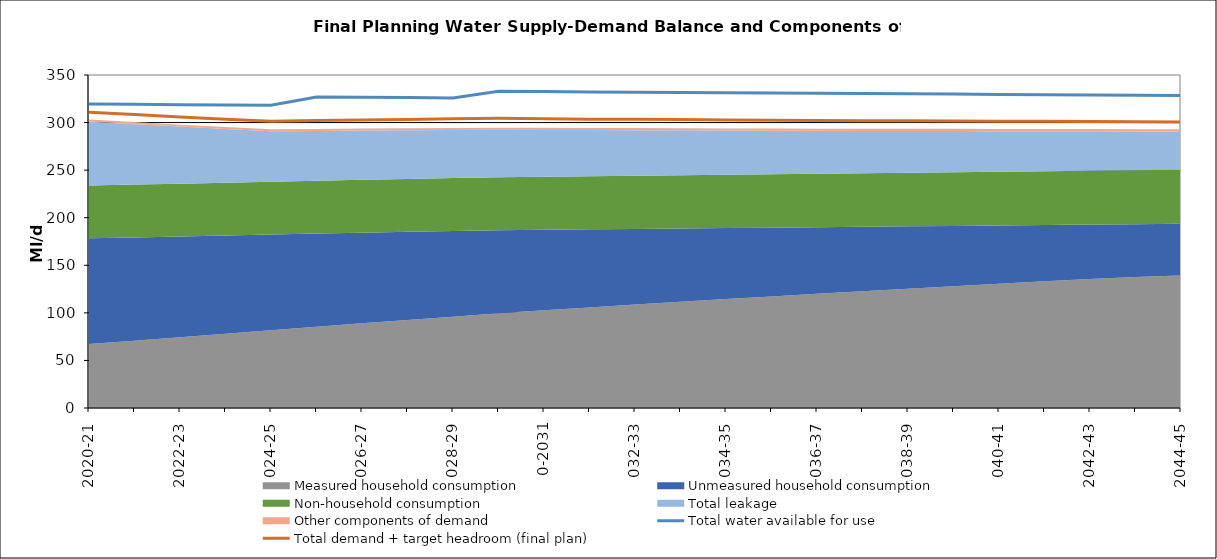
| Category | Total water available for use | Total demand + target headroom (final plan) |
|---|---|---|
| 0 | 319.431 | 310.906 |
| 1 | 319.143 | 308.387 |
| 2 | 318.856 | 305.78 |
| 3 | 318.568 | 303.611 |
| 4 | 318.28 | 301.501 |
| 5 | 326.978 | 302.082 |
| 6 | 326.525 | 302.746 |
| 7 | 326.233 | 303.201 |
| 8 | 325.941 | 303.897 |
| 9 | 332.822 | 304.485 |
| 10 | 332.53 | 304.037 |
| 11 | 332.238 | 303.62 |
| 12 | 331.946 | 303.392 |
| 13 | 331.653 | 303.107 |
| 14 | 331.361 | 302.79 |
| 15 | 331.069 | 302.484 |
| 16 | 330.777 | 302.131 |
| 17 | 330.484 | 301.986 |
| 18 | 330.192 | 301.867 |
| 19 | 329.9 | 301.589 |
| 20 | 329.608 | 301.431 |
| 21 | 329.315 | 301.331 |
| 22 | 329.023 | 301.156 |
| 23 | 328.731 | 300.79 |
| 24 | 328.438 | 300.699 |